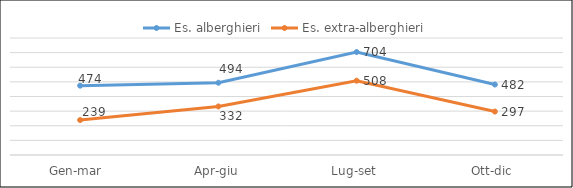
| Category | Es. alberghieri | Es. extra-alberghieri |
|---|---|---|
| Gen-mar  | 474 | 239 |
| Apr-giu | 494 | 332 |
| Lug-set | 704 | 508 |
| Ott-dic | 482 | 297 |